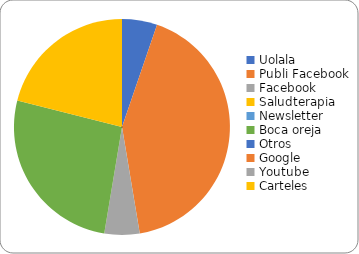
| Category | Series 0 |
|---|---|
| Uolala | 1 |
| Publi Facebook | 8 |
| Facebook | 1 |
| Saludterapia | 0 |
| Newsletter | 0 |
| Boca oreja | 5 |
| Otros | 0 |
| Google | 0 |
| Youtube | 0 |
| Carteles | 4 |